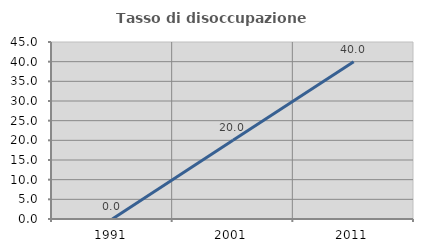
| Category | Tasso di disoccupazione giovanile  |
|---|---|
| 1991.0 | 0 |
| 2001.0 | 20 |
| 2011.0 | 40 |